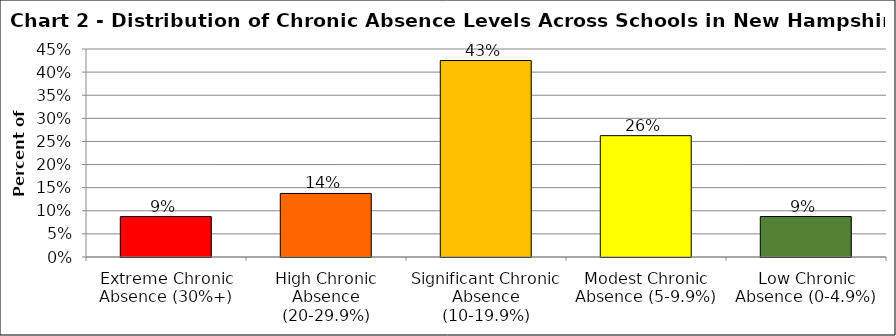
| Category | Series 1 |
|---|---|
| Extreme Chronic Absence (30%+) | 0.088 |
| High Chronic Absence (20-29.9%) | 0.138 |
| Significant Chronic Absence (10-19.9%) | 0.425 |
| Modest Chronic Absence (5-9.9%) | 0.262 |
| Low Chronic Absence (0-4.9%) | 0.088 |